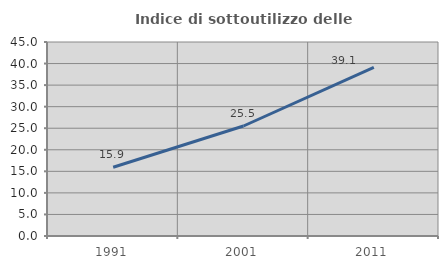
| Category | Indice di sottoutilizzo delle abitazioni  |
|---|---|
| 1991.0 | 15.944 |
| 2001.0 | 25.516 |
| 2011.0 | 39.116 |